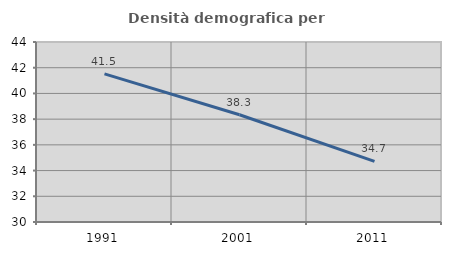
| Category | Densità demografica |
|---|---|
| 1991.0 | 41.516 |
| 2001.0 | 38.339 |
| 2011.0 | 34.712 |